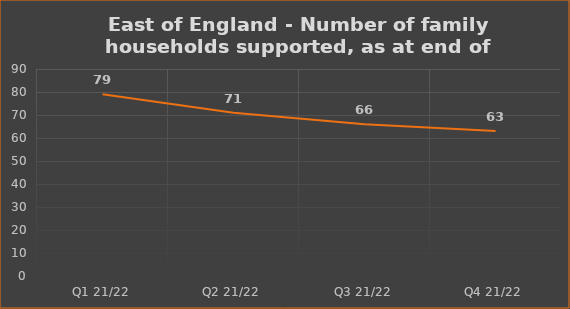
| Category | Number of financially supported households at end of quarter |
|---|---|
| Q1 21/22 | 79 |
| Q2 21/22 | 71 |
| Q3 21/22 | 66 |
| Q4 21/22 | 63 |